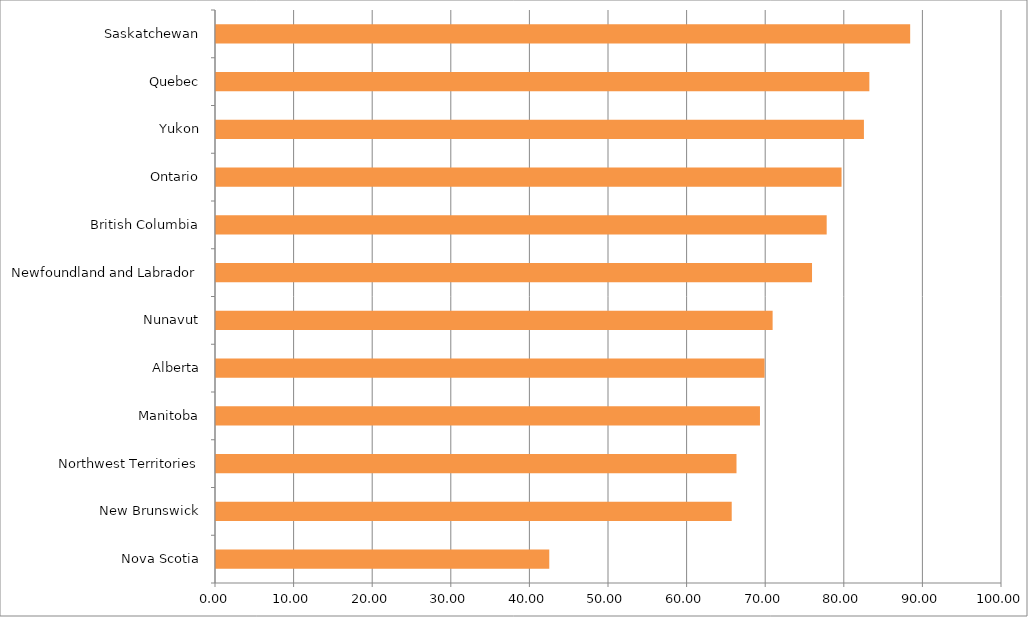
| Category | Series 0 |
|---|---|
| Nova Scotia | 42.401 |
| New Brunswick | 65.613 |
| Northwest Territories | 66.221 |
| Manitoba | 69.207 |
| Alberta | 69.793 |
| Nunavut | 70.817 |
| Newfoundland and Labrador | 75.83 |
| British Columbia | 77.696 |
| Ontario | 79.587 |
| Yukon | 82.434 |
| Quebec | 83.124 |
| Saskatchewan | 88.317 |